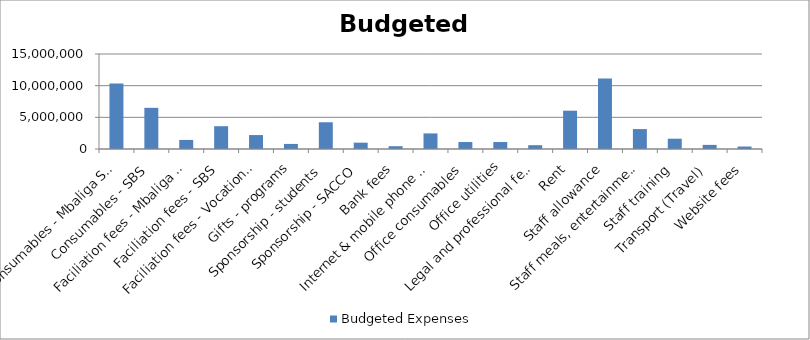
| Category | Budgeted Expenses |
|---|---|
| Consumables - Mbaliga School | 10349500 |
| Consumables - SBS | 6500000 |
| Faciliation fees - Mbaliga School | 1430000 |
| Faciliation fees - SBS | 3600000 |
| Faciliation fees - Vocational school | 2200000 |
| Gifts - programs | 800000 |
| Sponsorship - students | 4220000 |
| Sponsorship - SACCO | 1000000 |
| Bank fees | 443850 |
| Internet & mobile phone connection | 2459000 |
| Office consumables | 1100000 |
| Office utilities | 1100000 |
| Legal and professional fees | 600000 |
| Rent | 6050000 |
| Staff allowance | 11130000 |
| Staff meals, entertainment & welfare | 3145000 |
| Staff training | 1625000 |
| Transport (Travel) | 650000 |
| Website fees | 388500 |